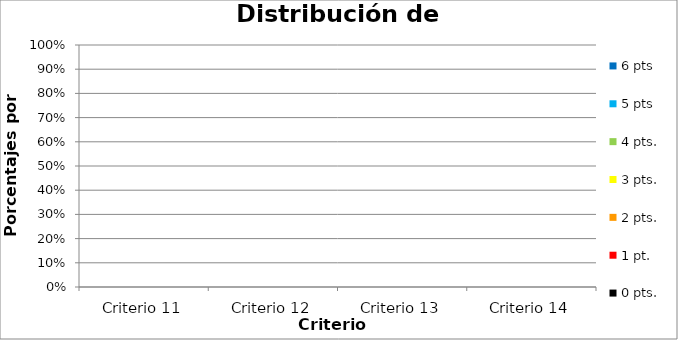
| Category | 6 pts | 5 pts | 4 pts. | 3 pts. | 2 pts. | 1 pt. | 0 pts. |
|---|---|---|---|---|---|---|---|
| Criterio 11 | 0 | 0 | 0 | 0 | 0 | 0 | 0 |
| Criterio 12 | 0 | 0 | 0 | 0 | 0 | 0 | 0 |
| Criterio 13 | 0 | 0 | 0 | 0 | 0 | 0 | 0 |
| Criterio 14 | 0 | 0 | 0 | 0 | 0 | 0 | 0 |